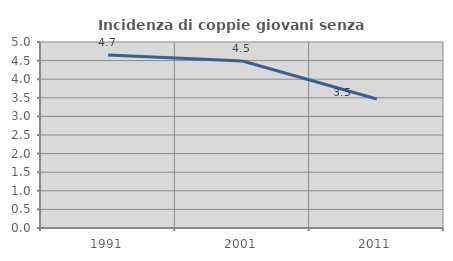
| Category | Incidenza di coppie giovani senza figli |
|---|---|
| 1991.0 | 4.654 |
| 2001.0 | 4.489 |
| 2011.0 | 3.467 |